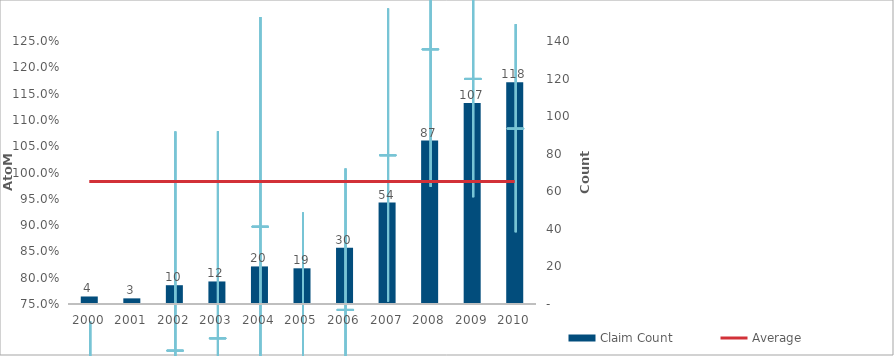
| Category | Claim Count |
|---|---|
| 0 | 4 |
| 1 | 3 |
| 2 | 10 |
| 3 | 12 |
| 4 | 20 |
| 5 | 19 |
| 6 | 30 |
| 7 | 54 |
| 8 | 87 |
| 9 | 107 |
| 10 | 118 |